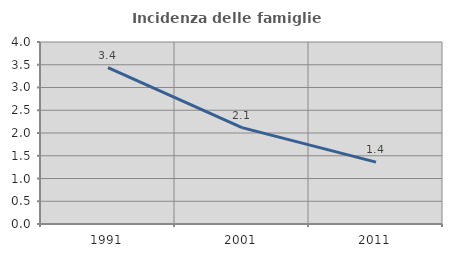
| Category | Incidenza delle famiglie numerose |
|---|---|
| 1991.0 | 3.436 |
| 2001.0 | 2.117 |
| 2011.0 | 1.361 |